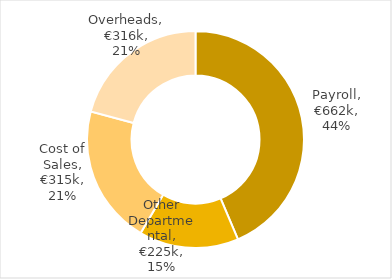
| Category | 2022 |
|---|---|
| Payroll | 661715 |
| Other Departmental | 225200 |
| Cost of Sales | 314560 |
| Overheads | 316172.5 |